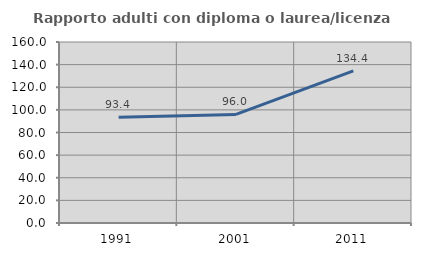
| Category | Rapporto adulti con diploma o laurea/licenza media  |
|---|---|
| 1991.0 | 93.407 |
| 2001.0 | 96 |
| 2011.0 | 134.437 |